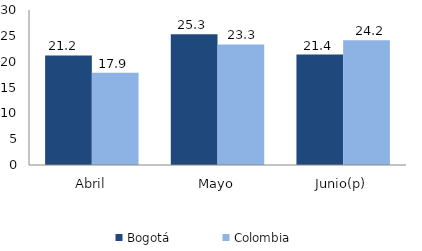
| Category | Bogotá | Colombia |
|---|---|---|
| Abril | 21.215 | 17.867 |
| Mayo | 25.31 | 23.336 |
| Junio(p) | 21.363 | 24.154 |